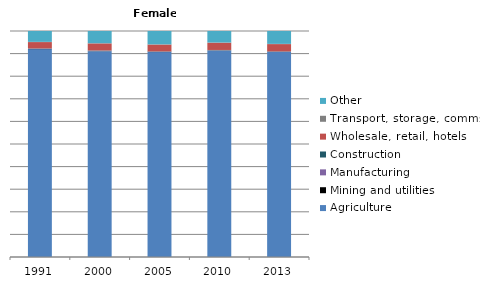
| Category | Agriculture | Mining and utilities | Manufacturing | Construction | Wholesale, retail, hotels | Transport, storage, comms | Other |
|---|---|---|---|---|---|---|---|
| 1991.0 | 91.9 | 0.1 | 0.1 | 0.1 | 2.8 | 0.1 | 4.8 |
| 2000.0 | 91 | 0.1 | 0.1 | 0.1 | 3.1 | 0.1 | 5.4 |
| 2005.0 | 90.6 | 0.1 | 0.1 | 0.1 | 3 | 0.1 | 5.9 |
| 2010.0 | 91.4 | 0.1 | 0.1 | 0.1 | 3.2 | 0.1 | 5.1 |
| 2013.0 | 90.7 | 0.1 | 0.1 | 0.1 | 3.2 | 0.1 | 5.7 |